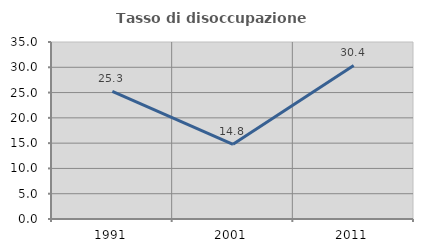
| Category | Tasso di disoccupazione giovanile  |
|---|---|
| 1991.0 | 25.254 |
| 2001.0 | 14.758 |
| 2011.0 | 30.375 |